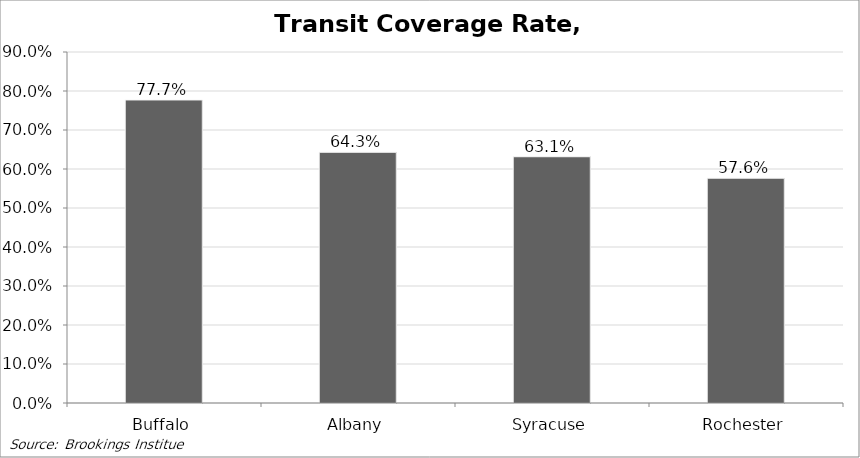
| Category | Transit Coverage Rate All |
|---|---|
| Buffalo | 0.777 |
| Albany | 0.643 |
| Syracuse | 0.631 |
| Rochester | 0.576 |